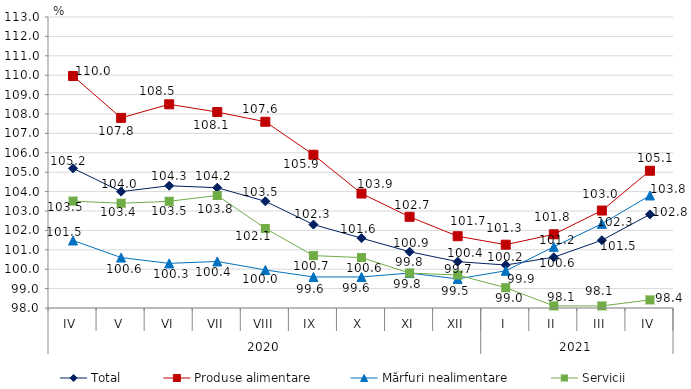
| Category | Total  | Produse alimentare | Mărfuri nealimentare  | Servicii |
|---|---|---|---|---|
| 0 | 105.2 | 109.96 | 101.48 | 103.51 |
| 1 | 104 | 107.8 | 100.6 | 103.4 |
| 2 | 104.3 | 108.5 | 100.3 | 103.5 |
| 3 | 104.2 | 108.1 | 100.4 | 103.8 |
| 4 | 103.5 | 107.6 | 99.96 | 102.1 |
| 5 | 102.3 | 105.9 | 99.6 | 100.7 |
| 6 | 101.6 | 103.9 | 99.6 | 100.6 |
| 7 | 100.9 | 102.7 | 99.8 | 99.8 |
| 8 | 100.39 | 101.7 | 99.5 | 99.7 |
| 9 | 100.216 | 101.263 | 99.917 | 99.046 |
| 10 | 100.619 | 101.8 | 101.154 | 98.109 |
| 11 | 101.493 | 103.024 | 102.337 | 98.107 |
| 12 | 102.826 | 105.075 | 103.801 | 98.417 |